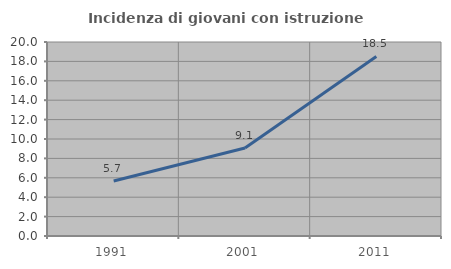
| Category | Incidenza di giovani con istruzione universitaria |
|---|---|
| 1991.0 | 5.676 |
| 2001.0 | 9.074 |
| 2011.0 | 18.512 |